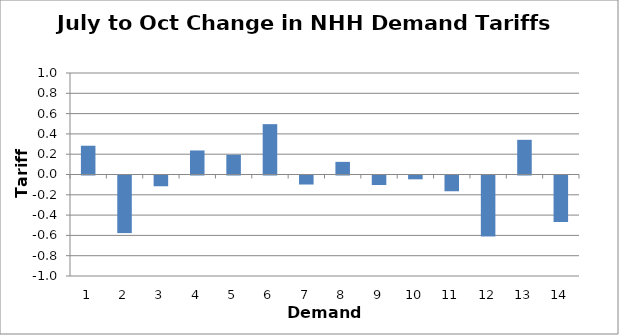
| Category | Change (p/kWh) |
|---|---|
| 0 | 0.283 |
| 1 | -0.567 |
| 2 | -0.106 |
| 3 | 0.237 |
| 4 | 0.194 |
| 5 | 0.496 |
| 6 | -0.089 |
| 7 | 0.124 |
| 8 | -0.094 |
| 9 | -0.038 |
| 10 | -0.155 |
| 11 | -0.601 |
| 12 | 0.342 |
| 13 | -0.458 |